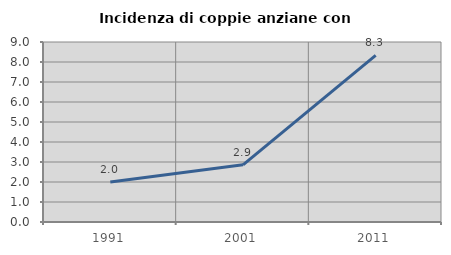
| Category | Incidenza di coppie anziane con figli |
|---|---|
| 1991.0 | 2 |
| 2001.0 | 2.857 |
| 2011.0 | 8.333 |